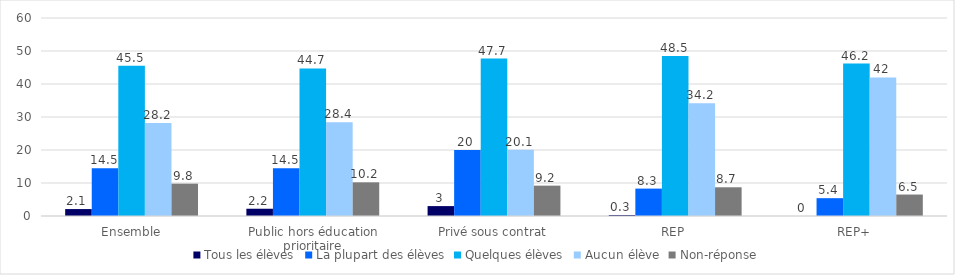
| Category | Tous les élèves | La plupart des élèves | Quelques élèves | Aucun élève | Non-réponse |
|---|---|---|---|---|---|
| Ensemble | 2.1 | 14.5 | 45.5 | 28.2 | 9.8 |
| Public hors éducation prioritaire | 2.2 | 14.5 | 44.7 | 28.4 | 10.2 |
| Privé sous contrat | 3 | 20 | 47.7 | 20.1 | 9.2 |
| REP | 0.3 | 8.3 | 48.5 | 34.2 | 8.7 |
| REP+ | 0 | 5.4 | 46.2 | 42 | 6.5 |